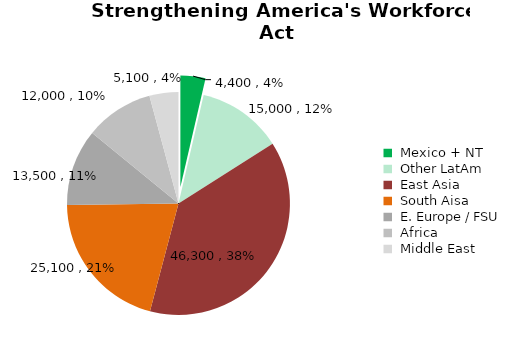
| Category | H1 Class Visas Issued |
|---|---|
|  Mexico + NT  | 4400 |
|  Other LatAm  | 15000 |
|  East Asia  | 46300 |
|  South Aisa  | 25100 |
|  E. Europe / FSU  | 13500 |
|  Africa  | 12000 |
|  Middle East  | 5100 |